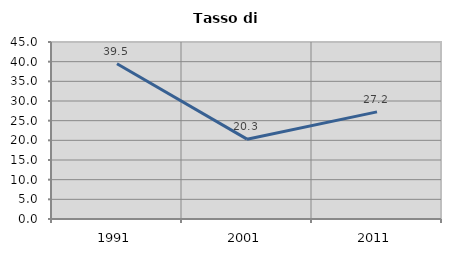
| Category | Tasso di disoccupazione   |
|---|---|
| 1991.0 | 39.479 |
| 2001.0 | 20.296 |
| 2011.0 | 27.239 |